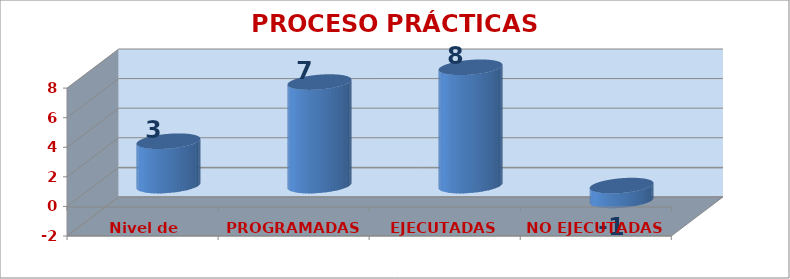
| Category | PROCESO PRÁCTICAS PEDAGÓGICAS |
|---|---|
| Nivel de satisfacción | 3 |
| PROGRAMADAS | 7 |
| EJECUTADAS | 8 |
| NO EJECUTADAS | -1 |